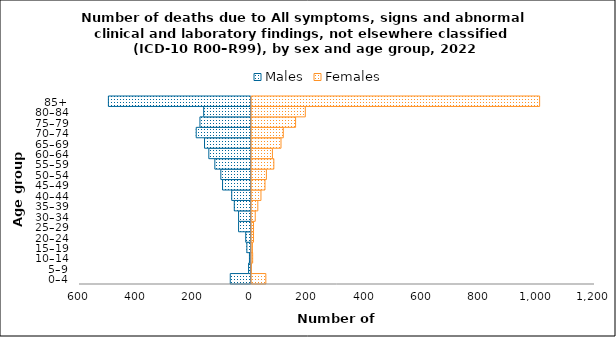
| Category | Males | Females |
|---|---|---|
| 0–4 | -73 | 53 |
| 5–9 | -9 | 2 |
| 10–14 | -6 | 7 |
| 15–19 | -15 | 6 |
| 20–24 | -19 | 10 |
| 25–29 | -44 | 10 |
| 30–34 | -44 | 16 |
| 35–39 | -59 | 25 |
| 40–44 | -68 | 36 |
| 45–49 | -100 | 50 |
| 50–54 | -106 | 55 |
| 55–59 | -127 | 81 |
| 60–64 | -148 | 76 |
| 65–69 | -163 | 106 |
| 70–74 | -192 | 114 |
| 75–79 | -179 | 157 |
| 80–84 | -166 | 191 |
| 85+ | -499 | 1010 |